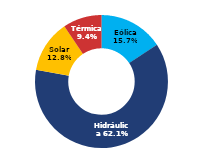
| Category | Sur |
|---|---|
| Eólica | 72.452 |
| Hidráulica | 287.189 |
| Solar | 58.952 |
| Térmica | 43.559 |